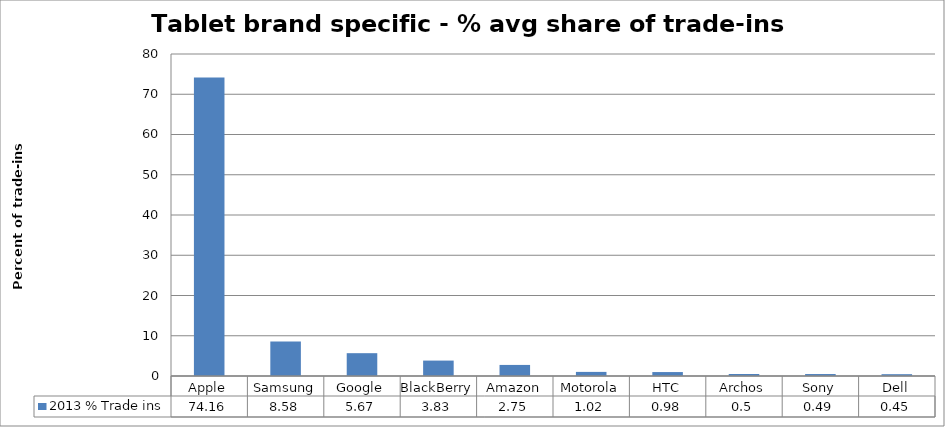
| Category | 2013 % Trade ins  |
|---|---|
| Apple | 74.16 |
| Samsung | 8.58 |
| Google | 5.67 |
| BlackBerry | 3.83 |
| Amazon | 2.75 |
| Motorola | 1.02 |
| HTC | 0.98 |
| Archos | 0.5 |
| Sony | 0.49 |
| Dell | 0.45 |